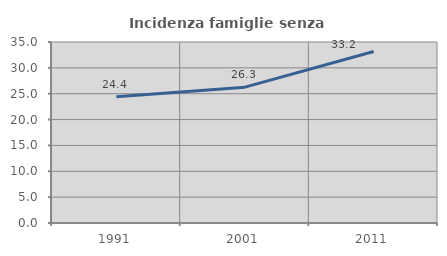
| Category | Incidenza famiglie senza nuclei |
|---|---|
| 1991.0 | 24.39 |
| 2001.0 | 26.269 |
| 2011.0 | 33.165 |